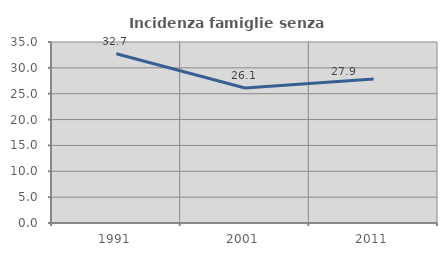
| Category | Incidenza famiglie senza nuclei |
|---|---|
| 1991.0 | 32.734 |
| 2001.0 | 26.102 |
| 2011.0 | 27.864 |